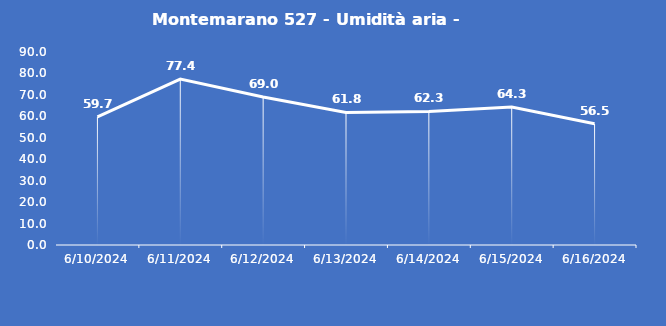
| Category | Montemarano 527 - Umidità aria - Grezzo (%) |
|---|---|
| 6/10/24 | 59.7 |
| 6/11/24 | 77.4 |
| 6/12/24 | 69 |
| 6/13/24 | 61.8 |
| 6/14/24 | 62.3 |
| 6/15/24 | 64.3 |
| 6/16/24 | 56.5 |